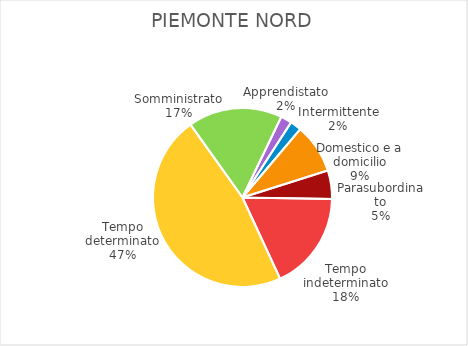
| Category | Piemonte Nord |
|---|---|
| Tempo indeterminato | 4366 |
| Tempo determinato | 11527 |
| Somministrato | 4165 |
| Apprendistato | 491 |
| Intermittente | 497 |
| Domestico e a domicilio | 2192 |
| Parasubordinato | 1266 |